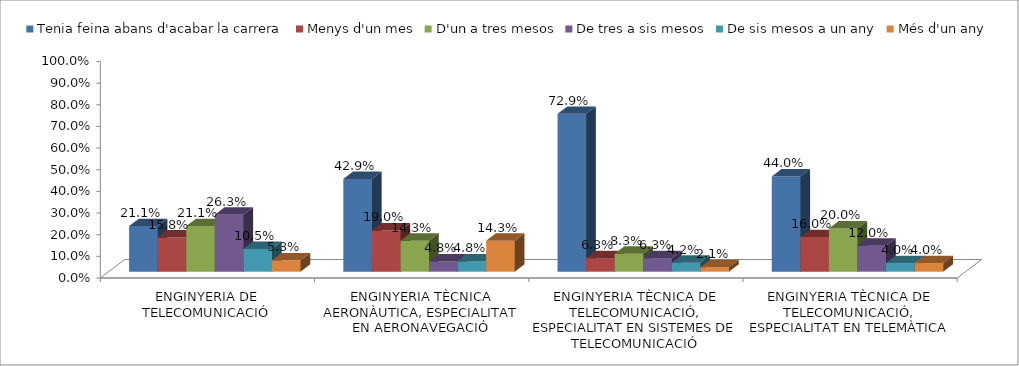
| Category | Tenia feina abans d'acabar la carrera | Menys d'un mes | D'un a tres mesos | De tres a sis mesos | De sis mesos a un any | Més d'un any |
|---|---|---|---|---|---|---|
| ENGINYERIA DE TELECOMUNICACIÓ | 0.211 | 0.158 | 0.211 | 0.263 | 0.105 | 0.053 |
| ENGINYERIA TÈCNICA AERONÀUTICA, ESPECIALITAT EN AERONAVEGACIÓ | 0.429 | 0.19 | 0.143 | 0.048 | 0.048 | 0.143 |
| ENGINYERIA TÈCNICA DE TELECOMUNICACIÓ, ESPECIALITAT EN SISTEMES DE TELECOMUNICACIÓ | 0.729 | 0.062 | 0.083 | 0.062 | 0.042 | 0.021 |
| ENGINYERIA TÈCNICA DE TELECOMUNICACIÓ, ESPECIALITAT EN TELEMÀTICA | 0.44 | 0.16 | 0.2 | 0.12 | 0.04 | 0.04 |